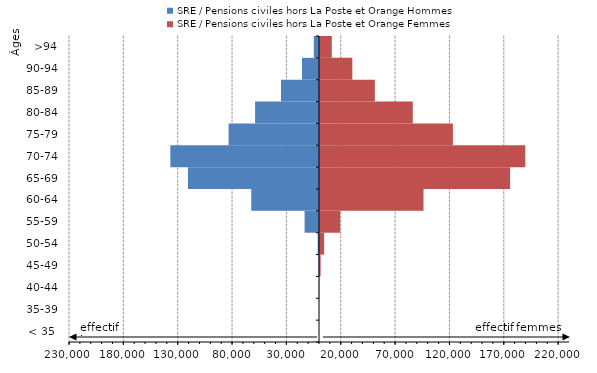
| Category | SRE / Pensions civiles hors La Poste et Orange Hommes | SRE / Pensions civiles hors La Poste et Orange Femmes |
|---|---|---|
| < 35  | -7 | 17 |
| 35-39 | -48 | 73 |
| 40-44 | -158 | 253 |
| 45-49 | -448 | 1460 |
| 50-54 | -1228 | 4720 |
| 55-59 | -13265 | 19463 |
| 60-64 | -62336 | 96135 |
| 65-69 | -120553 | 175787 |
| 70-74 | -136758 | 189799 |
| 75-79 | -83175 | 123190 |
| 80-84 | -58800 | 86288 |
| 85-89 | -34963 | 51404 |
| 90-94 | -15615 | 30649 |
| >94 | -4749 | 11787 |